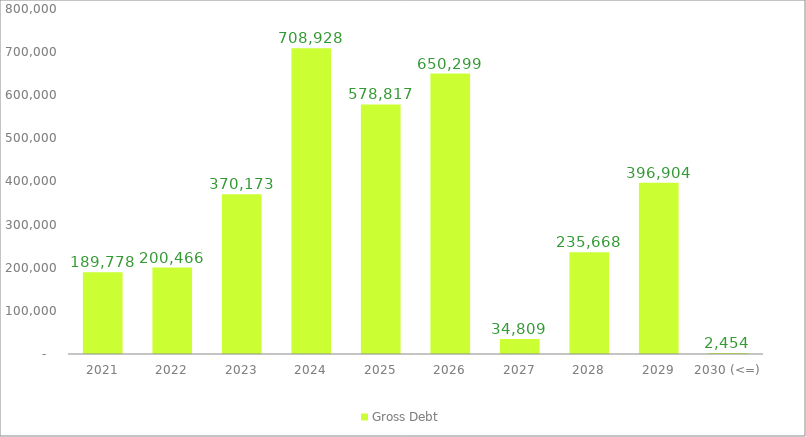
| Category | Gross Debt |
|---|---|
| 2021 | 189778.365 |
| 2022 | 200466.021 |
| 2023 | 370172.688 |
| 2024 | 708928.429 |
| 2025 | 578816.622 |
| 2026 | 650299.485 |
| 2027 | 34808.787 |
| 2028 | 235668.115 |
| 2029 | 396904.18 |
| 2030 (<=) | 2453.83 |